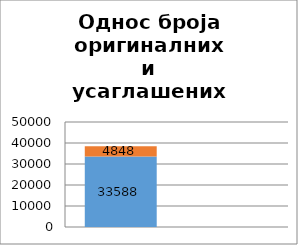
| Category | Учешће оригиналних захтева без усаглашавања | Учешће захтева са усаглашавањем |
|---|---|---|
| 0 | 33588 | 4848 |
| 1 | 0.874 | 0.126 |